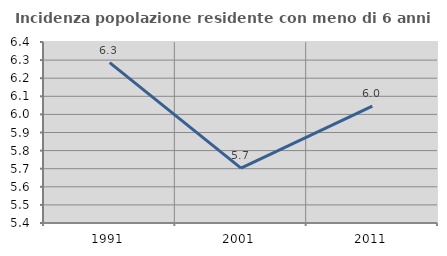
| Category | Incidenza popolazione residente con meno di 6 anni |
|---|---|
| 1991.0 | 6.286 |
| 2001.0 | 5.704 |
| 2011.0 | 6.045 |